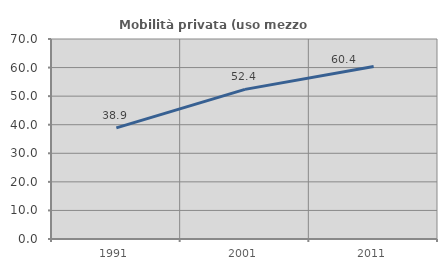
| Category | Mobilità privata (uso mezzo privato) |
|---|---|
| 1991.0 | 38.902 |
| 2001.0 | 52.365 |
| 2011.0 | 60.392 |